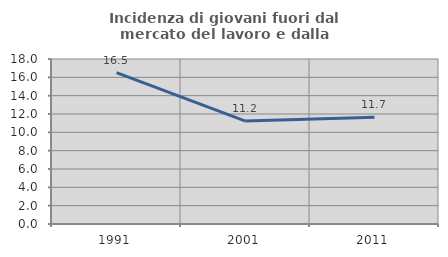
| Category | Incidenza di giovani fuori dal mercato del lavoro e dalla formazione  |
|---|---|
| 1991.0 | 16.512 |
| 2001.0 | 11.233 |
| 2011.0 | 11.656 |